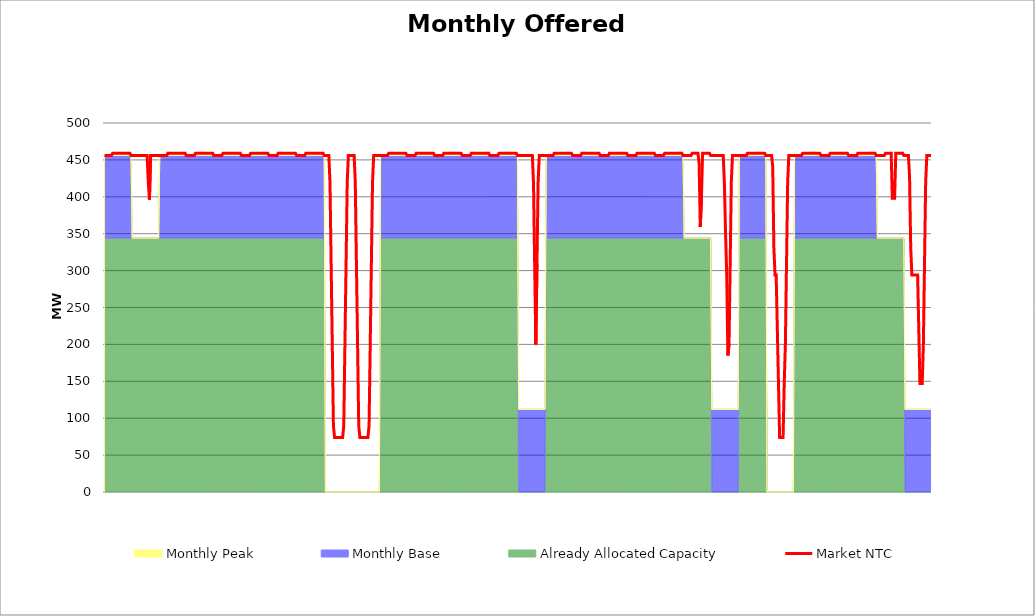
| Category | Market NTC |
|---|---|
| 0 | 456 |
| 1 | 456 |
| 2 | 456 |
| 3 | 456 |
| 4 | 456 |
| 5 | 456 |
| 6 | 456 |
| 7 | 459 |
| 8 | 459 |
| 9 | 459 |
| 10 | 459 |
| 11 | 459 |
| 12 | 459 |
| 13 | 459 |
| 14 | 459 |
| 15 | 459 |
| 16 | 459 |
| 17 | 459 |
| 18 | 459 |
| 19 | 459 |
| 20 | 459 |
| 21 | 459 |
| 22 | 459 |
| 23 | 456 |
| 24 | 456 |
| 25 | 456 |
| 26 | 456 |
| 27 | 456 |
| 28 | 456 |
| 29 | 456 |
| 30 | 456 |
| 31 | 456 |
| 32 | 456 |
| 33 | 456 |
| 34 | 456 |
| 35 | 456 |
| 36 | 456 |
| 37 | 456 |
| 38 | 420 |
| 39 | 396 |
| 40 | 456 |
| 41 | 456 |
| 42 | 456 |
| 43 | 456 |
| 44 | 456 |
| 45 | 456 |
| 46 | 456 |
| 47 | 456 |
| 48 | 456 |
| 49 | 456 |
| 50 | 456 |
| 51 | 456 |
| 52 | 456 |
| 53 | 456 |
| 54 | 456 |
| 55 | 459 |
| 56 | 459 |
| 57 | 459 |
| 58 | 459 |
| 59 | 459 |
| 60 | 459 |
| 61 | 459 |
| 62 | 459 |
| 63 | 459 |
| 64 | 459 |
| 65 | 459 |
| 66 | 459 |
| 67 | 459 |
| 68 | 459 |
| 69 | 459 |
| 70 | 459 |
| 71 | 456 |
| 72 | 456 |
| 73 | 456 |
| 74 | 456 |
| 75 | 456 |
| 76 | 456 |
| 77 | 456 |
| 78 | 456 |
| 79 | 459 |
| 80 | 459 |
| 81 | 459 |
| 82 | 459 |
| 83 | 459 |
| 84 | 459 |
| 85 | 459 |
| 86 | 459 |
| 87 | 459 |
| 88 | 459 |
| 89 | 459 |
| 90 | 459 |
| 91 | 459 |
| 92 | 459 |
| 93 | 459 |
| 94 | 459 |
| 95 | 456 |
| 96 | 456 |
| 97 | 456 |
| 98 | 456 |
| 99 | 456 |
| 100 | 456 |
| 101 | 456 |
| 102 | 456 |
| 103 | 459 |
| 104 | 459 |
| 105 | 459 |
| 106 | 459 |
| 107 | 459 |
| 108 | 459 |
| 109 | 459 |
| 110 | 459 |
| 111 | 459 |
| 112 | 459 |
| 113 | 459 |
| 114 | 459 |
| 115 | 459 |
| 116 | 459 |
| 117 | 459 |
| 118 | 459 |
| 119 | 456 |
| 120 | 456 |
| 121 | 456 |
| 122 | 456 |
| 123 | 456 |
| 124 | 456 |
| 125 | 456 |
| 126 | 456 |
| 127 | 459 |
| 128 | 459 |
| 129 | 459 |
| 130 | 459 |
| 131 | 459 |
| 132 | 459 |
| 133 | 459 |
| 134 | 459 |
| 135 | 459 |
| 136 | 459 |
| 137 | 459 |
| 138 | 459 |
| 139 | 459 |
| 140 | 459 |
| 141 | 459 |
| 142 | 459 |
| 143 | 456 |
| 144 | 456 |
| 145 | 456 |
| 146 | 456 |
| 147 | 456 |
| 148 | 456 |
| 149 | 456 |
| 150 | 456 |
| 151 | 459 |
| 152 | 459 |
| 153 | 459 |
| 154 | 459 |
| 155 | 459 |
| 156 | 459 |
| 157 | 459 |
| 158 | 459 |
| 159 | 459 |
| 160 | 459 |
| 161 | 459 |
| 162 | 459 |
| 163 | 459 |
| 164 | 459 |
| 165 | 459 |
| 166 | 459 |
| 167 | 456 |
| 168 | 456 |
| 169 | 456 |
| 170 | 456 |
| 171 | 456 |
| 172 | 456 |
| 173 | 456 |
| 174 | 456 |
| 175 | 459 |
| 176 | 459 |
| 177 | 459 |
| 178 | 459 |
| 179 | 459 |
| 180 | 459 |
| 181 | 459 |
| 182 | 459 |
| 183 | 459 |
| 184 | 459 |
| 185 | 459 |
| 186 | 459 |
| 187 | 459 |
| 188 | 459 |
| 189 | 459 |
| 190 | 459 |
| 191 | 456 |
| 192 | 456 |
| 193 | 456 |
| 194 | 456 |
| 195 | 456 |
| 196 | 420 |
| 197 | 310 |
| 198 | 200 |
| 199 | 90 |
| 200 | 74 |
| 201 | 74 |
| 202 | 74 |
| 203 | 74 |
| 204 | 74 |
| 205 | 74 |
| 206 | 74 |
| 207 | 74 |
| 208 | 90 |
| 209 | 200 |
| 210 | 310 |
| 211 | 420 |
| 212 | 456 |
| 213 | 456 |
| 214 | 456 |
| 215 | 456 |
| 216 | 456 |
| 217 | 456 |
| 218 | 420 |
| 219 | 310 |
| 220 | 200 |
| 221 | 90 |
| 222 | 74 |
| 223 | 74 |
| 224 | 74 |
| 225 | 74 |
| 226 | 74 |
| 227 | 74 |
| 228 | 74 |
| 229 | 74 |
| 230 | 90 |
| 231 | 200 |
| 232 | 310 |
| 233 | 420 |
| 234 | 456 |
| 235 | 456 |
| 236 | 456 |
| 237 | 456 |
| 238 | 456 |
| 239 | 456 |
| 240 | 456 |
| 241 | 456 |
| 242 | 456 |
| 243 | 456 |
| 244 | 456 |
| 245 | 456 |
| 246 | 456 |
| 247 | 459 |
| 248 | 459 |
| 249 | 459 |
| 250 | 459 |
| 251 | 459 |
| 252 | 459 |
| 253 | 459 |
| 254 | 459 |
| 255 | 459 |
| 256 | 459 |
| 257 | 459 |
| 258 | 459 |
| 259 | 459 |
| 260 | 459 |
| 261 | 459 |
| 262 | 459 |
| 263 | 456 |
| 264 | 456 |
| 265 | 456 |
| 266 | 456 |
| 267 | 456 |
| 268 | 456 |
| 269 | 456 |
| 270 | 456 |
| 271 | 459 |
| 272 | 459 |
| 273 | 459 |
| 274 | 459 |
| 275 | 459 |
| 276 | 459 |
| 277 | 459 |
| 278 | 459 |
| 279 | 459 |
| 280 | 459 |
| 281 | 459 |
| 282 | 459 |
| 283 | 459 |
| 284 | 459 |
| 285 | 459 |
| 286 | 459 |
| 287 | 456 |
| 288 | 456 |
| 289 | 456 |
| 290 | 456 |
| 291 | 456 |
| 292 | 456 |
| 293 | 456 |
| 294 | 456 |
| 295 | 459 |
| 296 | 459 |
| 297 | 459 |
| 298 | 459 |
| 299 | 459 |
| 300 | 459 |
| 301 | 459 |
| 302 | 459 |
| 303 | 459 |
| 304 | 459 |
| 305 | 459 |
| 306 | 459 |
| 307 | 459 |
| 308 | 459 |
| 309 | 459 |
| 310 | 459 |
| 311 | 456 |
| 312 | 456 |
| 313 | 456 |
| 314 | 456 |
| 315 | 456 |
| 316 | 456 |
| 317 | 456 |
| 318 | 456 |
| 319 | 459 |
| 320 | 459 |
| 321 | 459 |
| 322 | 459 |
| 323 | 459 |
| 324 | 459 |
| 325 | 459 |
| 326 | 459 |
| 327 | 459 |
| 328 | 459 |
| 329 | 459 |
| 330 | 459 |
| 331 | 459 |
| 332 | 459 |
| 333 | 459 |
| 334 | 459 |
| 335 | 456 |
| 336 | 456 |
| 337 | 456 |
| 338 | 456 |
| 339 | 456 |
| 340 | 456 |
| 341 | 456 |
| 342 | 456 |
| 343 | 459 |
| 344 | 459 |
| 345 | 459 |
| 346 | 459 |
| 347 | 459 |
| 348 | 459 |
| 349 | 459 |
| 350 | 459 |
| 351 | 459 |
| 352 | 459 |
| 353 | 459 |
| 354 | 459 |
| 355 | 459 |
| 356 | 459 |
| 357 | 459 |
| 358 | 459 |
| 359 | 456 |
| 360 | 456 |
| 361 | 456 |
| 362 | 456 |
| 363 | 456 |
| 364 | 456 |
| 365 | 456 |
| 366 | 456 |
| 367 | 456 |
| 368 | 456 |
| 369 | 456 |
| 370 | 456 |
| 371 | 456 |
| 372 | 456 |
| 373 | 417 |
| 374 | 307 |
| 375 | 200 |
| 376 | 310 |
| 377 | 420 |
| 378 | 456 |
| 379 | 456 |
| 380 | 456 |
| 381 | 456 |
| 382 | 456 |
| 383 | 456 |
| 384 | 456 |
| 385 | 456 |
| 386 | 456 |
| 387 | 456 |
| 388 | 456 |
| 389 | 456 |
| 390 | 456 |
| 391 | 459 |
| 392 | 459 |
| 393 | 459 |
| 394 | 459 |
| 395 | 459 |
| 396 | 459 |
| 397 | 459 |
| 398 | 459 |
| 399 | 459 |
| 400 | 459 |
| 401 | 459 |
| 402 | 459 |
| 403 | 459 |
| 404 | 459 |
| 405 | 459 |
| 406 | 459 |
| 407 | 456 |
| 408 | 456 |
| 409 | 456 |
| 410 | 456 |
| 411 | 456 |
| 412 | 456 |
| 413 | 456 |
| 414 | 456 |
| 415 | 459 |
| 416 | 459 |
| 417 | 459 |
| 418 | 459 |
| 419 | 459 |
| 420 | 459 |
| 421 | 459 |
| 422 | 459 |
| 423 | 459 |
| 424 | 459 |
| 425 | 459 |
| 426 | 459 |
| 427 | 459 |
| 428 | 459 |
| 429 | 459 |
| 430 | 459 |
| 431 | 456 |
| 432 | 456 |
| 433 | 456 |
| 434 | 456 |
| 435 | 456 |
| 436 | 456 |
| 437 | 456 |
| 438 | 456 |
| 439 | 459 |
| 440 | 459 |
| 441 | 459 |
| 442 | 459 |
| 443 | 459 |
| 444 | 459 |
| 445 | 459 |
| 446 | 459 |
| 447 | 459 |
| 448 | 459 |
| 449 | 459 |
| 450 | 459 |
| 451 | 459 |
| 452 | 459 |
| 453 | 459 |
| 454 | 459 |
| 455 | 456 |
| 456 | 456 |
| 457 | 456 |
| 458 | 456 |
| 459 | 456 |
| 460 | 456 |
| 461 | 456 |
| 462 | 456 |
| 463 | 459 |
| 464 | 459 |
| 465 | 459 |
| 466 | 459 |
| 467 | 459 |
| 468 | 459 |
| 469 | 459 |
| 470 | 459 |
| 471 | 459 |
| 472 | 459 |
| 473 | 459 |
| 474 | 459 |
| 475 | 459 |
| 476 | 459 |
| 477 | 459 |
| 478 | 459 |
| 479 | 456 |
| 480 | 456 |
| 481 | 456 |
| 482 | 456 |
| 483 | 456 |
| 484 | 456 |
| 485 | 456 |
| 486 | 456 |
| 487 | 459 |
| 488 | 459 |
| 489 | 459 |
| 490 | 459 |
| 491 | 459 |
| 492 | 459 |
| 493 | 459 |
| 494 | 459 |
| 495 | 459 |
| 496 | 459 |
| 497 | 459 |
| 498 | 459 |
| 499 | 459 |
| 500 | 459 |
| 501 | 459 |
| 502 | 459 |
| 503 | 456 |
| 504 | 456 |
| 505 | 456 |
| 506 | 456 |
| 507 | 456 |
| 508 | 456 |
| 509 | 456 |
| 510 | 456 |
| 511 | 459 |
| 512 | 459 |
| 513 | 459 |
| 514 | 459 |
| 515 | 459 |
| 516 | 459 |
| 517 | 445 |
| 518 | 359 |
| 519 | 398 |
| 520 | 459 |
| 521 | 459 |
| 522 | 459 |
| 523 | 459 |
| 524 | 459 |
| 525 | 459 |
| 526 | 459 |
| 527 | 456 |
| 528 | 456 |
| 529 | 456 |
| 530 | 456 |
| 531 | 456 |
| 532 | 456 |
| 533 | 456 |
| 534 | 456 |
| 535 | 456 |
| 536 | 456 |
| 537 | 456 |
| 538 | 456 |
| 539 | 416 |
| 540 | 350 |
| 541 | 295 |
| 542 | 185 |
| 543 | 200 |
| 544 | 310 |
| 545 | 420 |
| 546 | 456 |
| 547 | 456 |
| 548 | 456 |
| 549 | 456 |
| 550 | 456 |
| 551 | 456 |
| 552 | 456 |
| 553 | 456 |
| 554 | 456 |
| 555 | 456 |
| 556 | 456 |
| 557 | 456 |
| 558 | 456 |
| 559 | 459 |
| 560 | 459 |
| 561 | 459 |
| 562 | 459 |
| 563 | 459 |
| 564 | 459 |
| 565 | 459 |
| 566 | 459 |
| 567 | 459 |
| 568 | 459 |
| 569 | 459 |
| 570 | 459 |
| 571 | 459 |
| 572 | 459 |
| 573 | 459 |
| 574 | 459 |
| 575 | 456 |
| 576 | 456 |
| 577 | 456 |
| 578 | 456 |
| 579 | 456 |
| 580 | 456 |
| 581 | 441 |
| 582 | 331 |
| 583 | 294 |
| 584 | 294 |
| 585 | 221 |
| 586 | 147 |
| 587 | 74 |
| 588 | 74 |
| 589 | 74 |
| 590 | 74 |
| 591 | 147 |
| 592 | 200 |
| 593 | 310 |
| 594 | 420 |
| 595 | 456 |
| 596 | 456 |
| 597 | 456 |
| 598 | 456 |
| 599 | 456 |
| 600 | 456 |
| 601 | 456 |
| 602 | 456 |
| 603 | 456 |
| 604 | 456 |
| 605 | 456 |
| 606 | 456 |
| 607 | 459 |
| 608 | 459 |
| 609 | 459 |
| 610 | 459 |
| 611 | 459 |
| 612 | 459 |
| 613 | 459 |
| 614 | 459 |
| 615 | 459 |
| 616 | 459 |
| 617 | 459 |
| 618 | 459 |
| 619 | 459 |
| 620 | 459 |
| 621 | 459 |
| 622 | 459 |
| 623 | 456 |
| 624 | 456 |
| 625 | 456 |
| 626 | 456 |
| 627 | 456 |
| 628 | 456 |
| 629 | 456 |
| 630 | 456 |
| 631 | 459 |
| 632 | 459 |
| 633 | 459 |
| 634 | 459 |
| 635 | 459 |
| 636 | 459 |
| 637 | 459 |
| 638 | 459 |
| 639 | 459 |
| 640 | 459 |
| 641 | 459 |
| 642 | 459 |
| 643 | 459 |
| 644 | 459 |
| 645 | 459 |
| 646 | 459 |
| 647 | 456 |
| 648 | 456 |
| 649 | 456 |
| 650 | 456 |
| 651 | 456 |
| 652 | 456 |
| 653 | 456 |
| 654 | 456 |
| 655 | 459 |
| 656 | 459 |
| 657 | 459 |
| 658 | 459 |
| 659 | 459 |
| 660 | 459 |
| 661 | 459 |
| 662 | 459 |
| 663 | 459 |
| 664 | 459 |
| 665 | 459 |
| 666 | 459 |
| 667 | 459 |
| 668 | 459 |
| 669 | 459 |
| 670 | 459 |
| 671 | 456 |
| 672 | 456 |
| 673 | 456 |
| 674 | 456 |
| 675 | 456 |
| 676 | 456 |
| 677 | 456 |
| 678 | 456 |
| 679 | 459 |
| 680 | 459 |
| 681 | 459 |
| 682 | 459 |
| 683 | 459 |
| 684 | 459 |
| 685 | 398 |
| 686 | 398 |
| 687 | 398 |
| 688 | 459 |
| 689 | 459 |
| 690 | 459 |
| 691 | 459 |
| 692 | 459 |
| 693 | 459 |
| 694 | 459 |
| 695 | 456 |
| 696 | 456 |
| 697 | 456 |
| 698 | 456 |
| 699 | 456 |
| 700 | 426 |
| 701 | 331 |
| 702 | 294 |
| 703 | 294 |
| 704 | 294 |
| 705 | 294 |
| 706 | 294 |
| 707 | 294 |
| 708 | 221 |
| 709 | 147 |
| 710 | 147 |
| 711 | 147 |
| 712 | 200 |
| 713 | 310 |
| 714 | 420 |
| 715 | 456 |
| 716 | 456 |
| 717 | 456 |
| 718 | 456 |
| 719 | 456 |